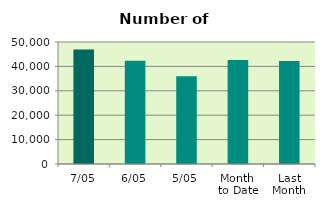
| Category | Series 0 |
|---|---|
| 7/05 | 46972 |
| 6/05 | 42276 |
| 5/05 | 35950 |
| Month 
to Date | 42596 |
| Last
Month | 42252.3 |